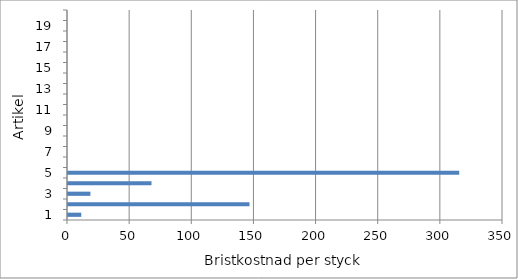
| Category | Series 0 |
|---|---|
| 0 | 10.664 |
| 1 | 146.037 |
| 2 | 18.043 |
| 3 | 67.205 |
| 4 | 314.767 |
| 5 | 0 |
| 6 | 0 |
| 7 | 0 |
| 8 | 0 |
| 9 | 0 |
| 10 | 0 |
| 11 | 0 |
| 12 | 0 |
| 13 | 0 |
| 14 | 0 |
| 15 | 0 |
| 16 | 0 |
| 17 | 0 |
| 18 | 0 |
| 19 | 0 |